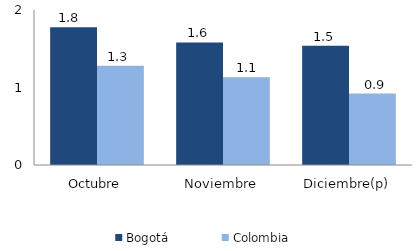
| Category | Bogotá | Colombia |
|---|---|---|
| Octubre | 1.778 | 1.281 |
| Noviembre | 1.581 | 1.131 |
| Diciembre(p) | 1.539 | 0.922 |